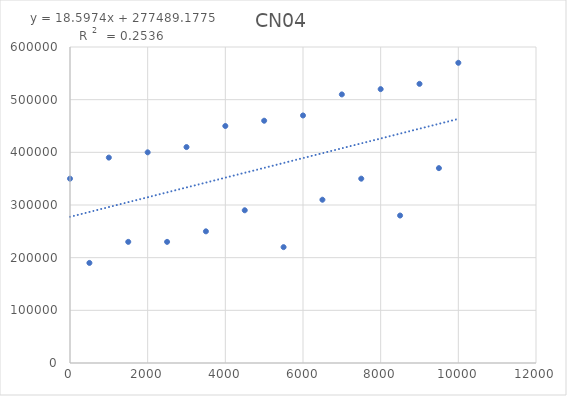
| Category | CN04 |
|---|---|
| 0.0 | 350000 |
| 500.0 | 190000 |
| 1000.0 | 390000 |
| 1500.0 | 230000 |
| 2000.0 | 400000 |
| 2500.0 | 230000 |
| 3000.0 | 410000 |
| 3500.0 | 250000 |
| 4000.0 | 450000 |
| 4500.0 | 290000 |
| 5000.0 | 460000 |
| 5500.0 | 220000 |
| 6000.0 | 470000 |
| 6500.0 | 310000 |
| 7000.0 | 510000 |
| 7500.0 | 350000 |
| 8000.0 | 520000 |
| 8500.0 | 280000 |
| 9000.0 | 530000 |
| 9500.0 | 370000 |
| 10000.0 | 570000 |